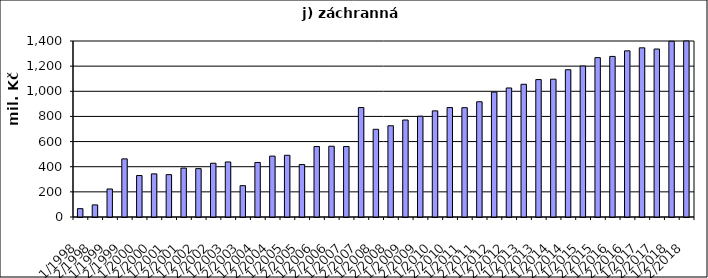
| Category | Series 0 |
|---|---|
| 1/1998 | 66476.929 |
| 2/1998 | 96320.045 |
| 1/1999 | 222731.277 |
| 2/1999 | 462318.723 |
| 1/2000 | 329770.663 |
| 2/2000 | 343088.897 |
| 1/2001 | 337057.235 |
| 2/2001 | 388890 |
| 1/2002 | 384782 |
| 2/2002 | 427616 |
| 1/2003 | 437820 |
| 2/2003 | 249320.645 |
| 1/2004 | 433821.283 |
| 2/2004 | 484347.376 |
| 1/2005 | 491066 |
| 2/2005 | 417330.157 |
| 1/2006 | 560844 |
| 2/2006 | 562996 |
| 1/2007 | 560876 |
| 2/2007 | 870639 |
| 1/2008 | 697531.955 |
| 2/2008 | 725754.045 |
| 1/2009 | 771449 |
| 2/2009 | 801781 |
| 1/2010 | 844255 |
| 2/2010 | 870516 |
| 1/2011 | 869587 |
| 2/2011 | 916761 |
| 1/2012 | 993581 |
| 2/2012 | 1026361 |
| 1/2013 | 1055798 |
| 2/2013 | 1093018 |
| 1/2014 | 1096258 |
| 2/2014 | 1171314 |
| 1/2015 | 1201135 |
| 2/2015 | 1267572 |
| 1/2016 | 1277235 |
| 2/2016 | 1321584 |
| 1/2017 | 1345611 |
| 2/2017 | 1336186 |
| 1/2018 | 1397878.954 |
| 2/2018 | 1408323.364 |